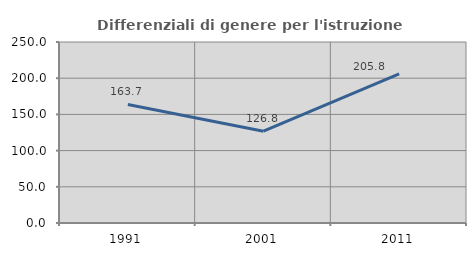
| Category | Differenziali di genere per l'istruzione superiore |
|---|---|
| 1991.0 | 163.743 |
| 2001.0 | 126.829 |
| 2011.0 | 205.833 |